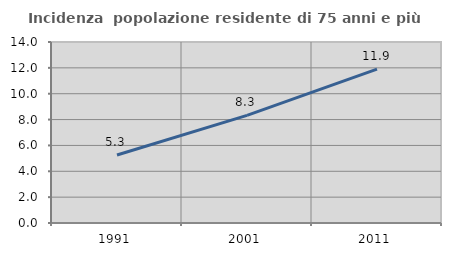
| Category | Incidenza  popolazione residente di 75 anni e più |
|---|---|
| 1991.0 | 5.261 |
| 2001.0 | 8.326 |
| 2011.0 | 11.907 |